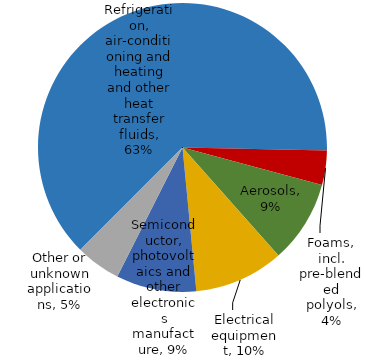
| Category | CO2e |
|---|---|
| Refrigeration, air-conditioning and heating and other heat transfer fluids | 0.628 |
| Foams, incl. pre-blended polyols | 0.039 |
| Aerosols | 0.093 |
| Electrical equipment | 0.1 |
| Semiconductor, photovoltaics and other electronics manufacture | 0.09 |
| Other or unknown applications | 0.05 |